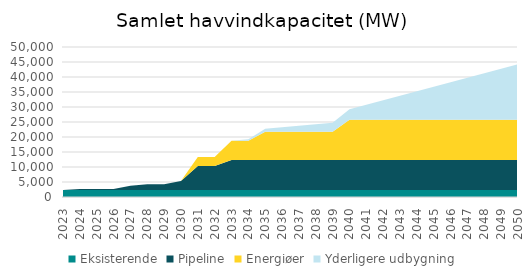
| Category | Eksisterende | Pipeline | Energiøer | Yderligere udbygning |
|---|---|---|---|---|
| 2023.0 | 2305.6 | 0 | 0 | 0 |
| 2024.0 | 2305.6 | 350 | 0 | 0 |
| 2025.0 | 2305.6 | 350 | 0 | 0 |
| 2026.0 | 2305.6 | 350 | 0 | 0 |
| 2027.0 | 2305.6 | 1430 | 0 | 0 |
| 2028.0 | 2305.6 | 1945 | 0 | 0 |
| 2029.0 | 2305.6 | 1945 | 0 | 0 |
| 2030.0 | 2305.6 | 3045 | 0 | 0 |
| 2031.0 | 2305.6 | 8045 | 3000 | 0 |
| 2032.0 | 2305.6 | 8045 | 3000 | 0 |
| 2033.0 | 2305.6 | 10045 | 6400 | 0 |
| 2034.0 | 2305.6 | 10045 | 6400 | 500 |
| 2035.0 | 2305.6 | 10045 | 9400 | 1000 |
| 2036.0 | 2305.6 | 10045 | 9400 | 1500 |
| 2037.0 | 2305.6 | 10045 | 9400 | 2000 |
| 2038.0 | 2305.6 | 10045 | 9400 | 2500 |
| 2039.0 | 2305.6 | 10045 | 9400 | 3000 |
| 2040.0 | 2305.6 | 10045 | 13400 | 3500 |
| 2041.0 | 2305.6 | 10045 | 13400 | 5000 |
| 2042.0 | 2305.6 | 10045 | 13400 | 6500 |
| 2043.0 | 2305.6 | 10045 | 13400 | 8000 |
| 2044.0 | 2305.6 | 10045 | 13400 | 9500 |
| 2045.0 | 2305.6 | 10045 | 13400 | 11000 |
| 2046.0 | 2305.6 | 10045 | 13400 | 12500 |
| 2047.0 | 2305.6 | 10045 | 13400 | 14000 |
| 2048.0 | 2305.6 | 10045 | 13400 | 15500 |
| 2049.0 | 2305.6 | 10045 | 13400 | 17000 |
| 2050.0 | 2305.6 | 10045 | 13400 | 18500 |